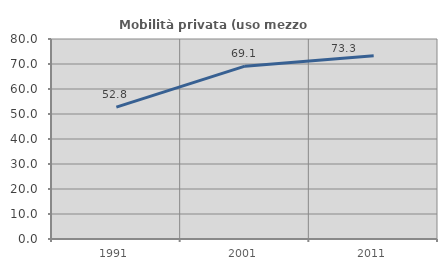
| Category | Mobilità privata (uso mezzo privato) |
|---|---|
| 1991.0 | 52.766 |
| 2001.0 | 69.141 |
| 2011.0 | 73.333 |